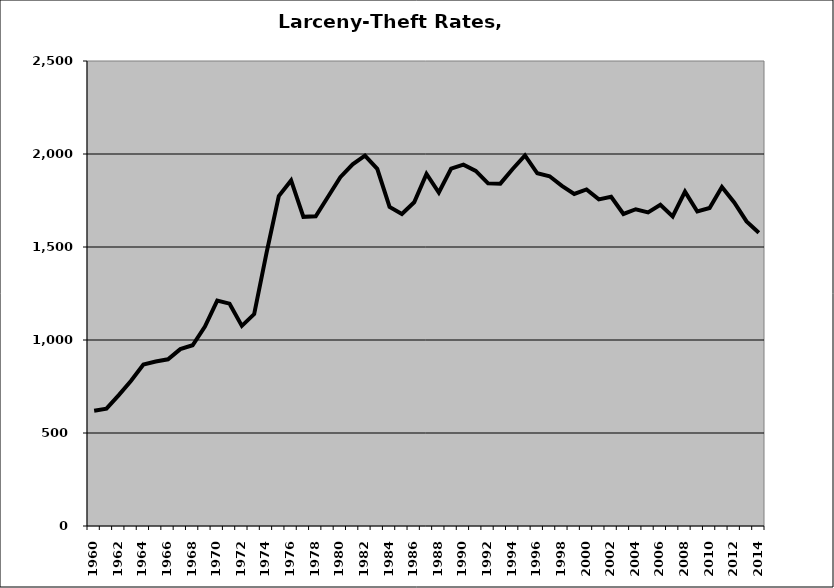
| Category | Larceny-Theft |
|---|---|
| 1960.0 | 619.817 |
| 1961.0 | 630.754 |
| 1962.0 | 703.829 |
| 1963.0 | 780.582 |
| 1964.0 | 868.313 |
| 1965.0 | 884.303 |
| 1966.0 | 896.387 |
| 1967.0 | 950.925 |
| 1968.0 | 971.694 |
| 1969.0 | 1071.968 |
| 1970.0 | 1211.501 |
| 1971.0 | 1195.369 |
| 1972.0 | 1075.932 |
| 1973.0 | 1139.198 |
| 1974.0 | 1466.786 |
| 1975.0 | 1774.176 |
| 1976.0 | 1857.73 |
| 1977.0 | 1662.146 |
| 1978.0 | 1664.694 |
| 1979.0 | 1770.088 |
| 1980.0 | 1875.502 |
| 1981.0 | 1944.66 |
| 1982.0 | 1991.274 |
| 1983.0 | 1920.355 |
| 1984.0 | 1715.283 |
| 1985.0 | 1677.16 |
| 1986.0 | 1740.397 |
| 1987.0 | 1892.46 |
| 1988.0 | 1792.825 |
| 1989.0 | 1921.411 |
| 1990.0 | 1942.693 |
| 1991.0 | 1909.103 |
| 1992.0 | 1842.503 |
| 1993.0 | 1840.723 |
| 1994.0 | 1919.232 |
| 1995.0 | 1992.383 |
| 1996.0 | 1896.318 |
| 1997.0 | 1880.425 |
| 1998.0 | 1828.532 |
| 1999.0 | 1785.461 |
| 2000.0 | 1809.628 |
| 2001.0 | 1755.99 |
| 2002.0 | 1769.71 |
| 2003.0 | 1677.509 |
| 2004.0 | 1702.989 |
| 2005.0 | 1686.092 |
| 2006.0 | 1727.145 |
| 2007.0 | 1664.138 |
| 2008.0 | 1797.907 |
| 2009.0 | 1690.684 |
| 2010.0 | 1709.673 |
| 2011.0 | 1822.519 |
| 2012.0 | 1739.81 |
| 2013.0 | 1637.61 |
| 2014.0 | 1577.086 |